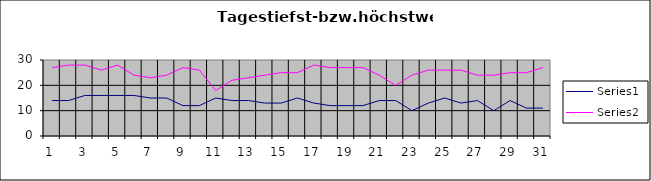
| Category | Series 0 | Series 1 |
|---|---|---|
| 0 | 14 | 27 |
| 1 | 14 | 28 |
| 2 | 16 | 28 |
| 3 | 16 | 26 |
| 4 | 16 | 28 |
| 5 | 16 | 24 |
| 6 | 15 | 23 |
| 7 | 15 | 24 |
| 8 | 12 | 27 |
| 9 | 12 | 26 |
| 10 | 15 | 18 |
| 11 | 14 | 22 |
| 12 | 14 | 23 |
| 13 | 13 | 24 |
| 14 | 13 | 25 |
| 15 | 15 | 25 |
| 16 | 13 | 28 |
| 17 | 12 | 27 |
| 18 | 12 | 27 |
| 19 | 12 | 27 |
| 20 | 14 | 24 |
| 21 | 14 | 20 |
| 22 | 10 | 24 |
| 23 | 13 | 26 |
| 24 | 15 | 26 |
| 25 | 13 | 26 |
| 26 | 14 | 24 |
| 27 | 10 | 24 |
| 28 | 14 | 25 |
| 29 | 11 | 25 |
| 30 | 11 | 27 |